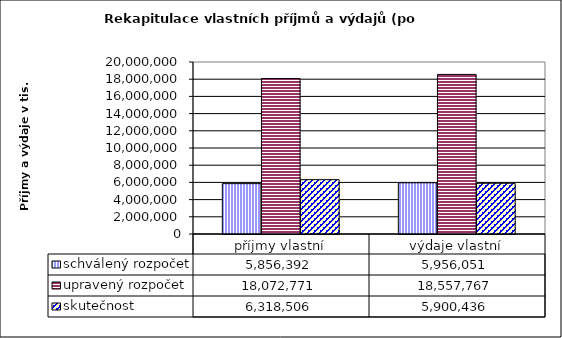
| Category | schválený rozpočet | upravený rozpočet | skutečnost |
|---|---|---|---|
| příjmy vlastní | 5856392 | 18072771 | 6318506 |
| výdaje vlastní | 5956051 | 18557767 | 5900436 |